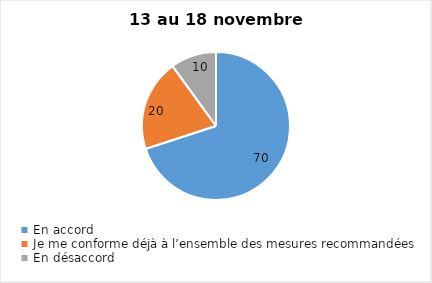
| Category | Series 0 |
|---|---|
| En accord | 70 |
| Je me conforme déjà à l’ensemble des mesures recommandées | 20 |
| En désaccord | 10 |